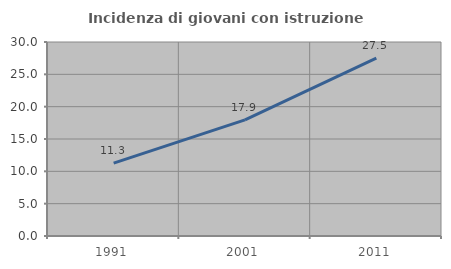
| Category | Incidenza di giovani con istruzione universitaria |
|---|---|
| 1991.0 | 11.268 |
| 2001.0 | 17.949 |
| 2011.0 | 27.5 |